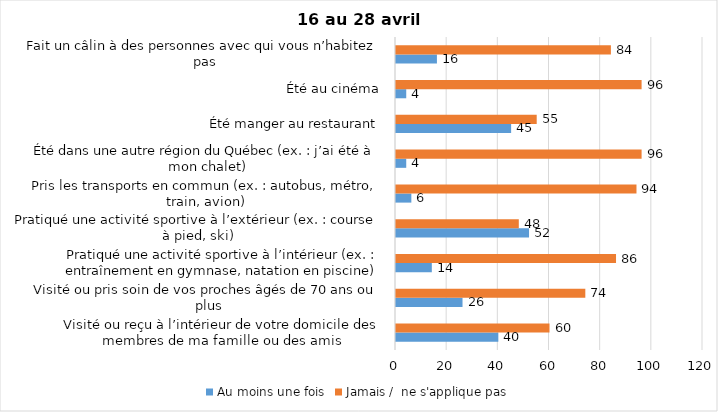
| Category | Au moins une fois | Jamais /  ne s'applique pas |
|---|---|---|
| Visité ou reçu à l’intérieur de votre domicile des membres de ma famille ou des amis | 40 | 60 |
| Visité ou pris soin de vos proches âgés de 70 ans ou plus | 26 | 74 |
| Pratiqué une activité sportive à l’intérieur (ex. : entraînement en gymnase, natation en piscine) | 14 | 86 |
| Pratiqué une activité sportive à l’extérieur (ex. : course à pied, ski) | 52 | 48 |
| Pris les transports en commun (ex. : autobus, métro, train, avion) | 6 | 94 |
| Été dans une autre région du Québec (ex. : j’ai été à mon chalet) | 4 | 96 |
| Été manger au restaurant | 45 | 55 |
| Été au cinéma | 4 | 96 |
| Fait un câlin à des personnes avec qui vous n’habitez pas | 16 | 84 |